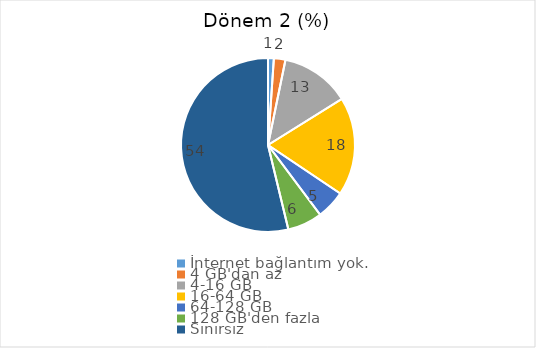
| Category | Dönem 2 (%) |
|---|---|
| İnternet bağlantım yok. | 1.075 |
| 4 GB'dan az | 2.151 |
| 4-16 GB | 12.903 |
| 16-64 GB | 18.28 |
| 64-128 GB | 5.376 |
| 128 GB'den fazla | 6.452 |
| Sınırsız | 53.763 |